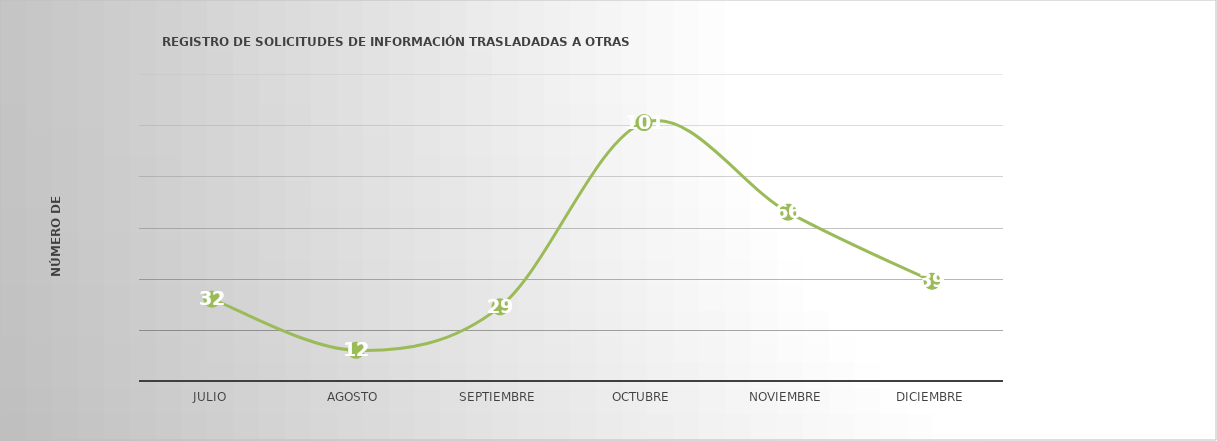
| Category | Series 0 |
|---|---|
| JULIO | 32 |
| AGOSTO | 12 |
| SEPTIEMBRE | 29 |
| OCTUBRE | 101 |
| NOVIEMBRE | 66 |
| DICIEMBRE | 39 |